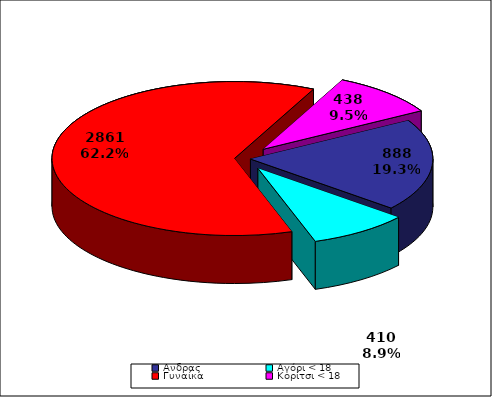
| Category | TOTAL |
|---|---|
| Aνδρας | 888 |
| Αγόρι < 18 | 410 |
| Γυναίκα | 2861 |
| Κορίτσι < 18 | 438 |